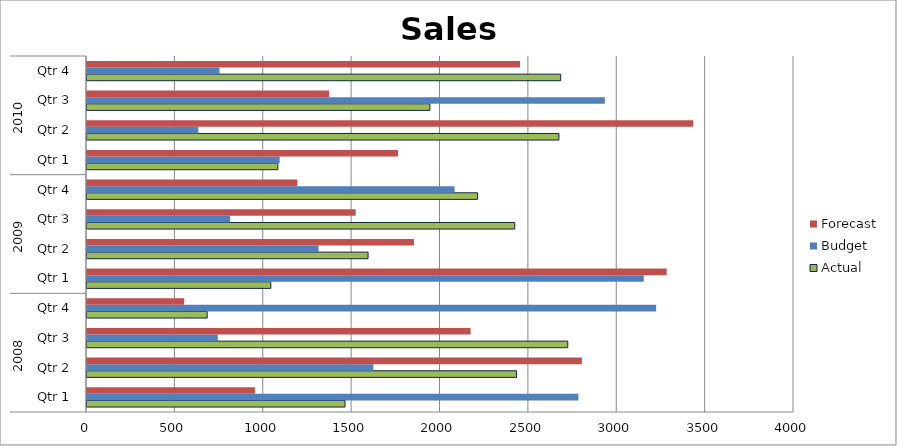
| Category | Actual | Budget | Forecast |
|---|---|---|---|
| 0 | 1460 | 2780 | 950 |
| 1 | 2430 | 1620 | 2800 |
| 2 | 2720 | 740 | 2170 |
| 3 | 680 | 3220 | 550 |
| 4 | 1040 | 3150 | 3280 |
| 5 | 1590 | 1310 | 1850 |
| 6 | 2420 | 810 | 1520 |
| 7 | 2210 | 2080 | 1190 |
| 8 | 1080 | 1090 | 1760 |
| 9 | 2670 | 630 | 3430 |
| 10 | 1940 | 2930 | 1370 |
| 11 | 2680 | 750 | 2450 |